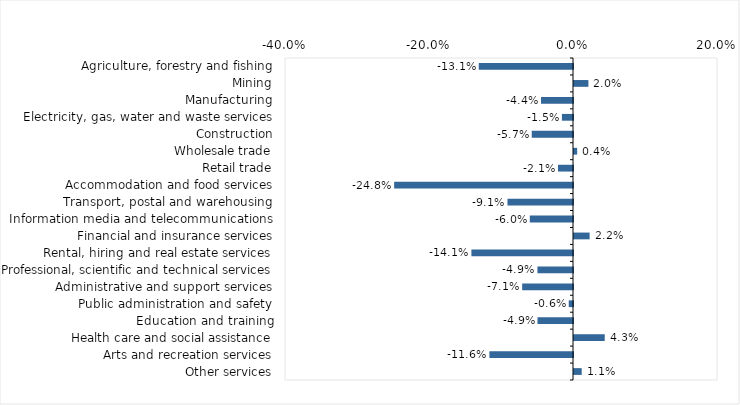
| Category | This week |
|---|---|
| Agriculture, forestry and fishing | -0.131 |
| Mining | 0.02 |
| Manufacturing | -0.044 |
| Electricity, gas, water and waste services | -0.015 |
| Construction | -0.057 |
| Wholesale trade | 0.004 |
| Retail trade | -0.021 |
| Accommodation and food services | -0.248 |
| Transport, postal and warehousing | -0.091 |
| Information media and telecommunications | -0.06 |
| Financial and insurance services | 0.022 |
| Rental, hiring and real estate services | -0.141 |
| Professional, scientific and technical services | -0.049 |
| Administrative and support services | -0.071 |
| Public administration and safety | -0.006 |
| Education and training | -0.049 |
| Health care and social assistance | 0.043 |
| Arts and recreation services | -0.116 |
| Other services | 0.011 |